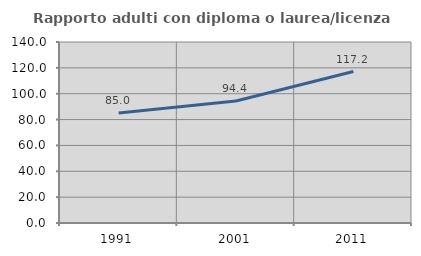
| Category | Rapporto adulti con diploma o laurea/licenza media  |
|---|---|
| 1991.0 | 85 |
| 2001.0 | 94.375 |
| 2011.0 | 117.16 |